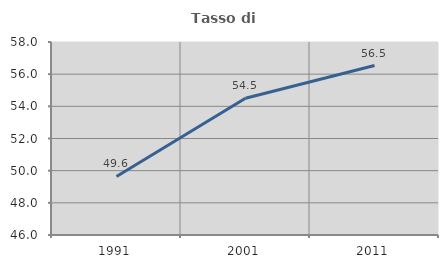
| Category | Tasso di occupazione   |
|---|---|
| 1991.0 | 49.641 |
| 2001.0 | 54.506 |
| 2011.0 | 56.537 |